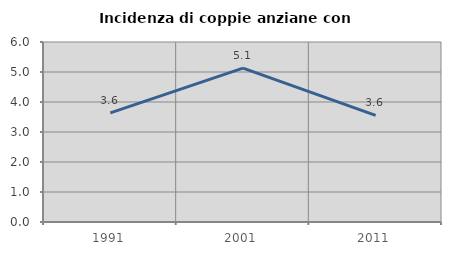
| Category | Incidenza di coppie anziane con figli |
|---|---|
| 1991.0 | 3.636 |
| 2001.0 | 5.128 |
| 2011.0 | 3.553 |